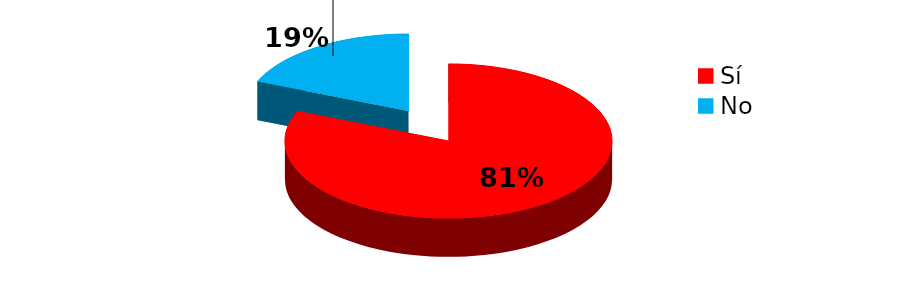
| Category | Series 0 |
|---|---|
| Sí | 256 |
| No | 59 |